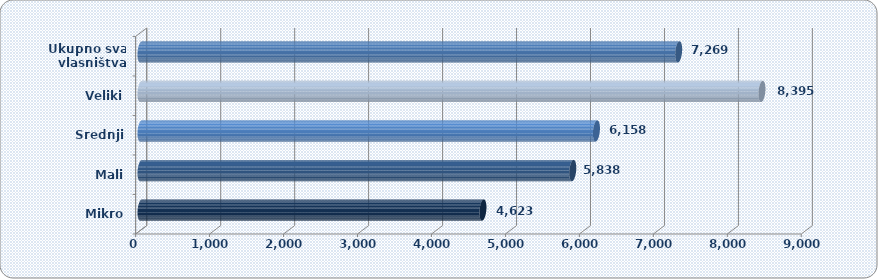
| Category | Prosječna mjesečna neto plaća po zaposlenom |
|---|---|
| Mikro | 4623.122 |
| Mali | 5837.658 |
| Srednji | 6157.627 |
| Veliki | 8395.487 |
| Ukupno sva
 vlasništva | 7269.315 |